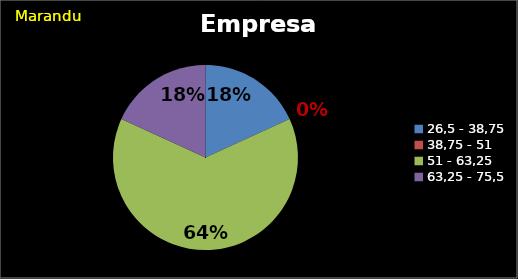
| Category | Series 0 |
|---|---|
| 26,5 - 38,75 | 0.182 |
| 38,75 - 51 | 0 |
| 51 - 63,25 | 0.636 |
| 63,25 - 75,5 | 0.182 |